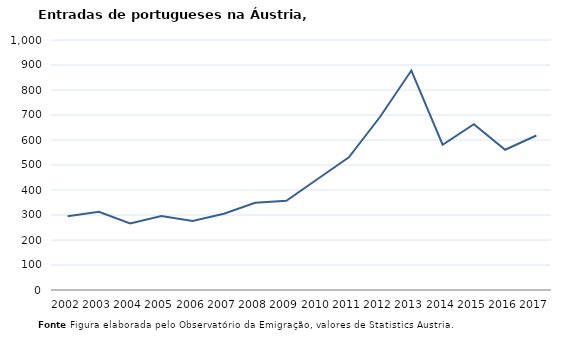
| Category | Entradas |
|---|---|
| 2002.0 | 295 |
| 2003.0 | 313 |
| 2004.0 | 266 |
| 2005.0 | 296 |
| 2006.0 | 276 |
| 2007.0 | 305 |
| 2008.0 | 349 |
| 2009.0 | 357 |
| 2010.0 | 444 |
| 2011.0 | 531 |
| 2012.0 | 693 |
| 2013.0 | 878 |
| 2014.0 | 581 |
| 2015.0 | 663 |
| 2016.0 | 561 |
| 2017.0 | 618 |